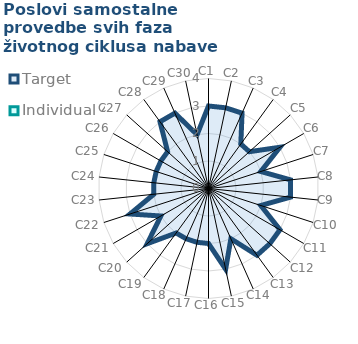
| Category | Target | Individual 4 |
|---|---|---|
| C1 | 3 | 0 |
| C2 | 3 | 0 |
| C3 | 3 | 0 |
| C4 | 2 | 0 |
| C5 | 2 | 0 |
| C6 | 3 | 0 |
| C7 | 2 | 0 |
| C8 | 3 | 0 |
| C9 | 3 | 0 |
| C10 | 2 | 0 |
| C11 | 3 | 0 |
| C12 | 3 | 0 |
| C13 | 3 | 0 |
| C14 | 2 | 0 |
| C15 | 3 | 0 |
| C16 | 2 | 0 |
| C17 | 2 | 0 |
| C18 | 2 | 0 |
| C19 | 2 | 0 |
| C20 | 3 | 0 |
| C21 | 2 | 0 |
| C22 | 3 | 0 |
| C23 | 2 | 0 |
| C24 | 2 | 0 |
| C25 | 2 | 0 |
| C26 | 2 | 0 |
| C27 | 2 | 0 |
| C28 | 3 | 0 |
| C29 | 3 | 0 |
| C30 | 2 | 0 |